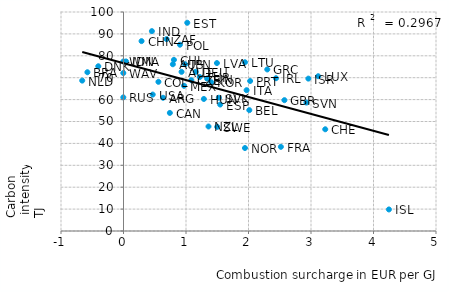
| Category | Series 0 |
|---|---|
| -0.577648766 | 72.495 |
| -0.660377358 | 68.67 |
| -0.403483309 | 75.228 |
| -0.002902758 | 77.413 |
| 0.040638607 | 77.413 |
| -0.002902758 | 72.131 |
| -0.002902758 | 61.02 |
| 0.288824383 | 86.703 |
| 0.454281567 | 91.257 |
| 0.689404935 | 87.614 |
| 0.90275762 | 85.064 |
| 0.806966618 | 78.142 |
| 0.789550073 | 76.138 |
| 0.985486212 | 76.138 |
| 0.928882438 | 72.678 |
| 1.020319303 | 95.082 |
| 1.494920174 | 76.685 |
| 1.155297533 | 72.678 |
| 1.08563135 | 68.852 |
| 0.968069666 | 66.302 |
| 1.220609579 | 70.31 |
| 1.338171263 | 69.581 |
| 1.403483309 | 67.942 |
| 1.943396226 | 77.049 |
| 2.026124819 | 68.488 |
| 1.969521045 | 64.299 |
| 0.467343977 | 62.295 |
| 0.558780842 | 68.124 |
| 0.632801161 | 60.838 |
| 0.741654572 | 53.916 |
| 1.285921626 | 60.291 |
| 1.525399129 | 60.838 |
| 1.547169811 | 57.741 |
| 1.499274311 | 47.541 |
| 1.359941945 | 47.723 |
| 2.013062409 | 55.191 |
| 1.943396226 | 37.887 |
| 2.518142235 | 38.434 |
| 2.574746009 | 59.745 |
| 2.439767779 | 69.763 |
| 2.300435414 | 73.77 |
| 2.957910015 | 69.581 |
| 3.114658926 | 70.674 |
| 2.92743106 | 58.652 |
| 3.227866473 | 46.448 |
| 4.246734398 | 9.836 |